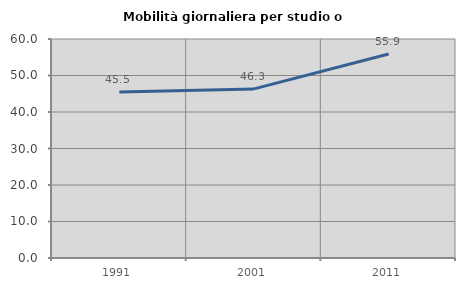
| Category | Mobilità giornaliera per studio o lavoro |
|---|---|
| 1991.0 | 45.494 |
| 2001.0 | 46.329 |
| 2011.0 | 55.882 |